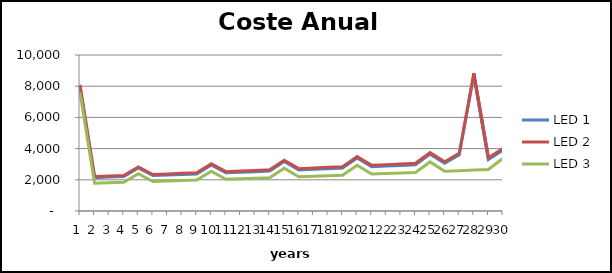
| Category | LED 1 | LED 2 | LED 3 |
|---|---|---|---|
| 0 | 7941.4 | 8090.517 | 7591.083 |
| 1 | 2139.603 | 2206.371 | 1784.03 |
| 2 | 2171.612 | 2239.381 | 1810.704 |
| 3 | 2204.101 | 2272.885 | 1837.779 |
| 4 | 2757.379 | 2827.194 | 2385.561 |
| 5 | 2270.549 | 2341.409 | 1893.152 |
| 6 | 2304.522 | 2376.444 | 1921.463 |
| 7 | 2339.005 | 2412.005 | 1950.198 |
| 8 | 2374.005 | 2448.099 | 1979.365 |
| 9 | 2956.372 | 3031.576 | 2555.812 |
| 10 | 2445.588 | 2521.919 | 2039.018 |
| 11 | 2482.187 | 2559.661 | 2069.517 |
| 12 | 2519.334 | 2597.97 | 2100.473 |
| 13 | 2557.039 | 2636.853 | 2131.894 |
| 14 | 3170.047 | 3251.057 | 2738.523 |
| 15 | 2634.155 | 2716.378 | 2196.157 |
| 16 | 2673.582 | 2757.038 | 2229.013 |
| 17 | 2713.601 | 2798.307 | 2262.362 |
| 18 | 2754.22 | 2840.195 | 2296.211 |
| 19 | 3399.502 | 3486.766 | 2934.622 |
| 20 | 2837.295 | 2925.866 | 2365.44 |
| 21 | 2879.769 | 2969.668 | 2400.835 |
| 22 | 2922.881 | 3014.127 | 2436.762 |
| 23 | 2966.639 | 3059.253 | 2473.227 |
| 24 | 3645.921 | 3739.922 | 3145.106 |
| 25 | 3056.134 | 3151.545 | 2547.806 |
| 26 | 3606.91 | 3706.548 | 2585.937 |
| 27 | 8710.648 | 8837.708 | 2624.64 |
| 28 | 3307.113 | 3407.414 | 2663.923 |
| 29 | 3910.574 | 4011.834 | 3371.048 |